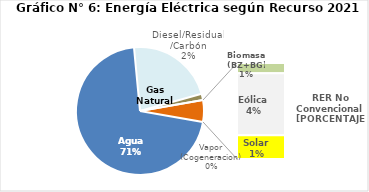
| Category | Series 0 |
|---|---|
| Agua | 3267.007 |
| Gas Natural | 1023.094 |
| Diesel/Residual/Carbón | 73.415 |
| Vapor (Cogeneracion) | 0.213 |
| Biomasa (BZ+BG) | 27.057 |
| Eólica | 164.149 |
| Solar | 62.416 |